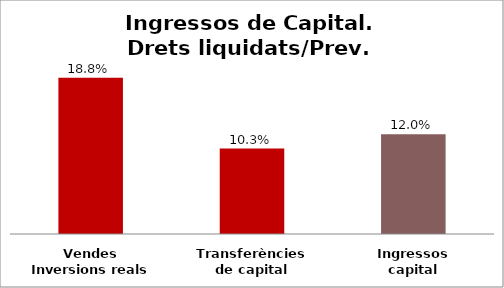
| Category | Series 0 |
|---|---|
| Vendes Inversions reals | 0.188 |
| Transferències de capital | 0.103 |
| Ingressos capital | 0.12 |